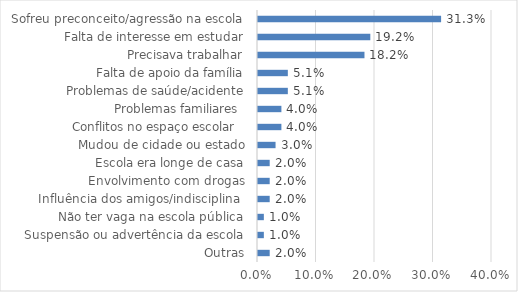
| Category | Series 0 |
|---|---|
| Outras | 0.02 |
| Suspensão ou advertência da escola | 0.01 |
| Não ter vaga na escola pública | 0.01 |
| Influência dos amigos/indisciplina  | 0.02 |
| Envolvimento com drogas | 0.02 |
| Escola era longe de casa | 0.02 |
| Mudou de cidade ou estado | 0.03 |
| Conflitos no espaço escolar   | 0.04 |
| Problemas familiares  | 0.04 |
| Problemas de saúde/acidente | 0.051 |
| Falta de apoio da família | 0.051 |
| Precisava trabalhar | 0.182 |
| Falta de interesse em estudar | 0.192 |
| Sofreu preconceito/agressão na escola | 0.313 |